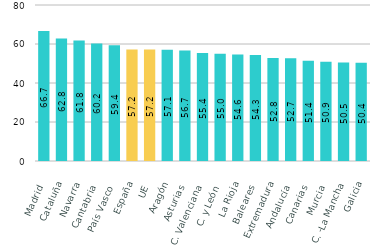
| Category | Habilidades básicas o avanzadas |
|---|---|
| Madrid | 66.7 |
| Cataluña | 62.8 |
| Navarra | 61.8 |
| Cantabria | 60.2 |
| País Vasco | 59.4 |
| España | 57.2 |
| UE | 57.2 |
| Aragón | 57.1 |
| Asturias | 56.7 |
| C. Valenciana | 55.4 |
| C. y León | 55 |
| La Rioja | 54.6 |
| Baleares | 54.3 |
| Extremadura | 52.8 |
| Andalucía | 52.7 |
| Canarias | 51.4 |
| Murcia | 50.9 |
| C. -La Mancha | 50.5 |
| Galicia | 50.4 |